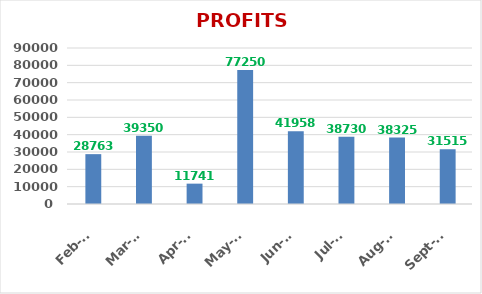
| Category | PROFITS (Rs.) |
|---|---|
| 2019-09-01 | 31515 |
| 2019-08-01 | 38325 |
| 2019-07-01 | 38730 |
| 2019-06-01 | 41958 |
| 2019-05-01 | 77250 |
| 2019-04-01 | 11741 |
| 2019-03-01 | 39350 |
| 2019-02-01 | 28763 |